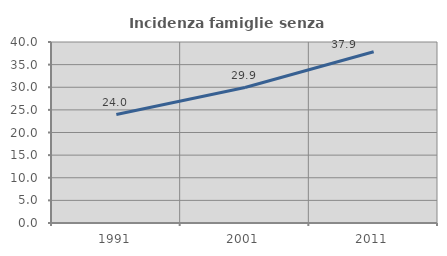
| Category | Incidenza famiglie senza nuclei |
|---|---|
| 1991.0 | 23.975 |
| 2001.0 | 29.94 |
| 2011.0 | 37.85 |